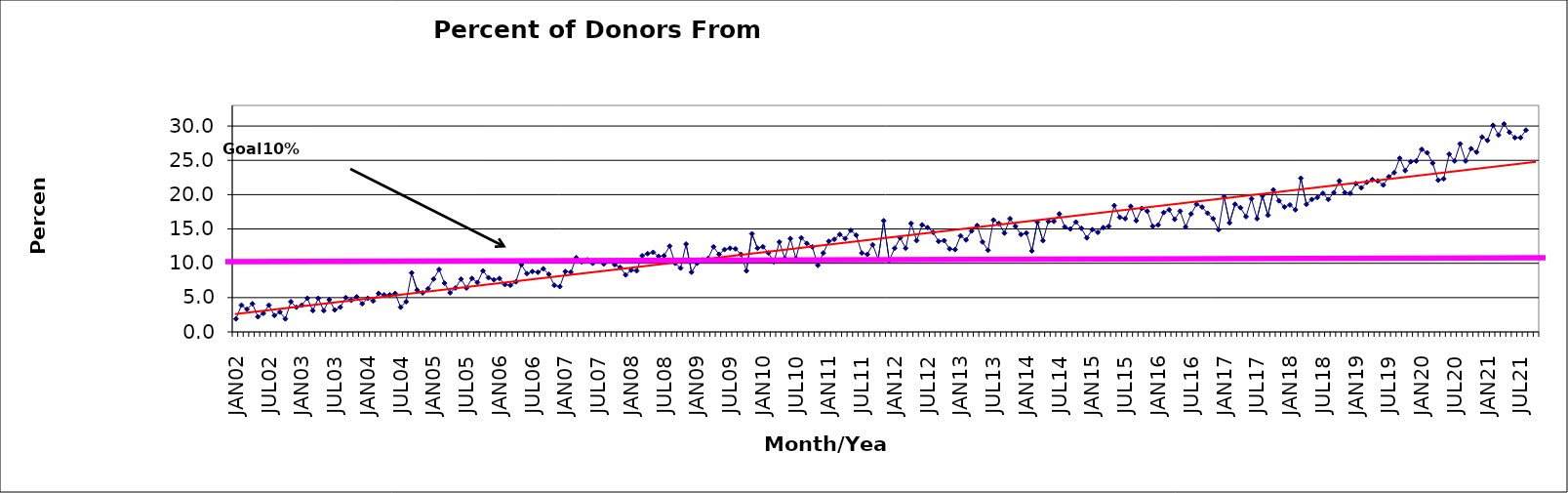
| Category | Series 0 |
|---|---|
| JAN02 | 1.9 |
| FEB02 | 3.9 |
| MAR02 | 3.3 |
| APR02 | 4.1 |
| MAY02 | 2.2 |
| JUN02 | 2.7 |
| JUL02 | 3.9 |
| AUG02 | 2.4 |
| SEP02 | 2.9 |
| OCT02 | 1.9 |
| NOV02 | 4.4 |
| DEC02 | 3.6 |
| JAN03 | 3.9 |
| FEB03 | 4.9 |
| MAR03 | 3.1 |
| APR03 | 4.9 |
| MAY03 | 3.1 |
| JUN03 | 4.7 |
| JUL03 | 3.2 |
| AUG03 | 3.6 |
| SEP03 | 5 |
| OCT03 | 4.6 |
| NOV03 | 5.1 |
| DEC03 | 4.1 |
| JAN04 | 4.9 |
| FEB04 | 4.5 |
| MAR04 | 5.6 |
| APR04 | 5.4 |
| MAY04 | 5.4 |
| JUN04 | 5.6 |
| JUL04 | 3.6 |
| AUG04 | 4.4 |
| SEP04 | 8.6 |
| OCT04 | 6.1 |
| NOV04 | 5.7 |
| DEC04 | 6.3 |
| JAN05 | 7.7 |
| FEB05 | 9.1 |
| MAR05 | 7.1 |
| APR05 | 5.7 |
| MAY05 | 6.4 |
| JUN05 | 7.7 |
| JUL05 | 6.4 |
| AUG05 | 7.8 |
| SEP05 | 7.2 |
| OCT05 | 8.9 |
| NOV05 | 7.9 |
| DEC05 | 7.6 |
| JAN06 | 7.8 |
| FEB06 | 6.9 |
| MAR06 | 6.8 |
| APR06 | 7.3 |
| MAY06 | 9.8 |
| JUN06 | 8.5 |
| JUL06 | 8.8 |
| AUG06 | 8.7 |
| SEP06 | 9.2 |
| OCT06 | 8.4 |
| NOV06 | 6.8 |
| DEC06 | 6.6 |
| JAN07 | 8.8 |
| FEB07 | 8.7 |
| MAR07 | 10.8 |
| APR07 | 10.2 |
| MAY07 | 10.5 |
| JUN07 | 10 |
| JUL07 | 10.3 |
| AUG07 | 9.9 |
| SEP07 | 10.4 |
| OCT07 | 9.8 |
| NOV07 | 9.4 |
| DEC07 | 8.3 |
| JAN08 | 9 |
| FEB08 | 8.9 |
| MAR08 | 11.1 |
| APR08 | 11.4 |
| MAY08 | 11.6 |
| JUN08 | 11 |
| JUL08 | 11.1 |
| AUG08 | 12.5 |
| SEP08 | 10 |
| OCT08 | 9.3 |
| NOV08 | 12.8 |
| DEC08 | 8.7 |
| JAN09 | 10 |
| FEB09 | 10.5 |
| MAR09 | 10.7 |
| APR09 | 12.4 |
| MAY09 | 11.3 |
| JUN09 | 12 |
| JUL09 | 12.2 |
| AUG09 | 12.1 |
| SEP09 | 11.3 |
| OCT09 | 8.9 |
| NOV09 | 14.3 |
| DEC09 | 12.2 |
| JAN10 | 12.4 |
| FEB10 | 11.5 |
| MAR10 | 10.2 |
| APR10 | 13.1 |
| MAY10 | 10.7 |
| JUN10 | 13.6 |
| JUL10 | 10.7 |
| AUG10 | 13.7 |
| SEP10 | 12.9 |
| OCT10 | 12.4 |
| NOV10 | 9.7 |
| DEC10 | 11.5 |
| JAN11 | 13.2 |
| FEB11 | 13.5 |
| MAR11 | 14.2 |
| APR11 | 13.6 |
| MAY11 | 14.8 |
| JUN11 | 14.1 |
| JUL11 | 11.5 |
| AUG11 | 11.3 |
| SEP11 | 12.7 |
| OCT11 | 10.6 |
| NOV11 | 16.2 |
| DEC11 | 10.4 |
| JAN12 | 12.2 |
| FEB12 | 13.7 |
| MAR12 | 12.2 |
| APR12 | 15.8 |
| MAY12 | 13.3 |
| JUN12 | 15.6 |
| JUL12 | 15.2 |
| AUG12 | 14.5 |
| SEP12 | 13.2 |
| OCT12 | 13.3 |
| NOV12 | 12.1 |
| DEC12 | 12 |
| JAN13 | 14 |
| FEB13 | 13.4 |
| MAR13 | 14.7 |
| APR13 | 15.5 |
| MAY13 | 13.1 |
| JUN13 | 11.9 |
| JUL13 | 16.3 |
| AUG13 | 15.8 |
| SEP13 | 14.4 |
| OCT13 | 16.5 |
| NOV13 | 15.4 |
| DEC13 | 14.2 |
| JAN14 | 14.4 |
| FEB14 | 11.8 |
| MAR14 | 16 |
| APR14 | 13.3 |
| MAY14 | 16.1 |
| JUN14 | 16.1 |
| JUL14 | 17.2 |
| AUG14 | 15.3 |
| SEP14 | 15 |
| OCT14 | 16 |
| NOV14 | 15.1 |
| DEC14 | 13.7 |
| JAN15 | 14.9 |
| FEB15 | 14.5 |
| MAR15 | 15.2 |
| APR15 | 15.4 |
| MAY15 | 18.4 |
| JUN15 | 16.7 |
| JUL15 | 16.5 |
| AUG15 | 18.3 |
| SEP15 | 16.2 |
| OCT15 | 18 |
| NOV15 | 17.6 |
| DEC15 | 15.4 |
| JAN16 | 15.6 |
| FEB16 | 17.4 |
| MAR16 | 17.8 |
| APR16 | 16.4 |
| MAY16 | 17.6 |
| JUN16 | 15.3 |
| JUL16 | 17.2 |
| AUG16 | 18.6 |
| SEP16 | 18.2 |
| OCT16 | 17.3 |
| NOV16 | 16.5 |
| DEC16 | 14.9 |
| JAN17 | 19.7 |
| FEB17 | 15.9 |
| MAR17 | 18.6 |
| APR17 | 18.1 |
| MAY17 | 16.8 |
| JUN17 | 19.4 |
| JUL17 | 16.5 |
| AUG17 | 19.8 |
| SEP17 | 17 |
| OCT17 | 20.7 |
| NOV17 | 19.1 |
| DEC17 | 18.2 |
| JAN18 | 18.5 |
| FEB18 | 17.8 |
| MAR18 | 22.4 |
| APR18 | 18.6 |
| MAY18 | 19.3 |
| JUN18 | 19.6 |
| JUL18 | 20.2 |
| AUG18 | 19.3 |
| SEP18 | 20.3 |
| OCT18 | 22 |
| NOV18 | 20.3 |
| DEC18 | 20.2 |
| JAN19 | 21.6 |
| FEB19 | 21 |
| MAR19 | 21.8 |
| APR19 | 22.2 |
| MAY19 | 22 |
| JUN19 | 21.4 |
| JUL19 | 22.6 |
| AUG19 | 23.2 |
| SEP19 | 25.3 |
| OCT19 | 23.5 |
| NOV19 | 24.8 |
| DEC19 | 24.9 |
| JAN20 | 26.6 |
| FEB20 | 26.1 |
| MAR20 | 24.6 |
| APR20 | 22.1 |
| MAY20 | 22.3 |
| JUN20 | 25.9 |
| JUL20 | 24.9 |
| AUG20 | 27.4 |
| SEP20 | 24.9 |
| OCT20 | 26.7 |
| NOV20 | 26.2 |
| DEC20 | 28.4 |
| JAN21 | 27.9 |
| FEB21 | 30.1 |
| MAR21 | 28.7 |
| APR21 | 30.3 |
| MAY21 | 29.1 |
| JUN21 | 28.3 |
| JUL21 | 28.3 |
| AUG21 | 29.4 |